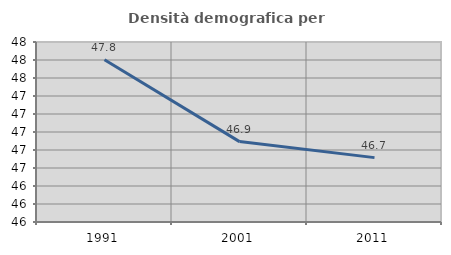
| Category | Densità demografica |
|---|---|
| 1991.0 | 47.803 |
| 2001.0 | 46.893 |
| 2011.0 | 46.715 |